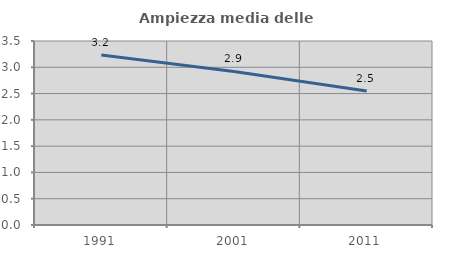
| Category | Ampiezza media delle famiglie |
|---|---|
| 1991.0 | 3.232 |
| 2001.0 | 2.921 |
| 2011.0 | 2.547 |